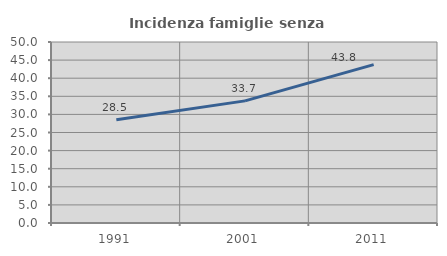
| Category | Incidenza famiglie senza nuclei |
|---|---|
| 1991.0 | 28.547 |
| 2001.0 | 33.736 |
| 2011.0 | 43.761 |